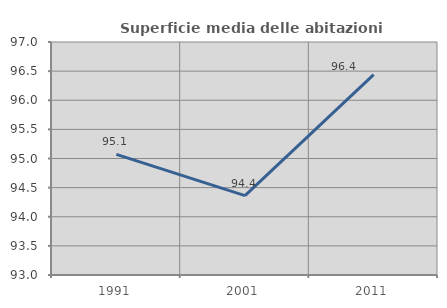
| Category | Superficie media delle abitazioni occupate |
|---|---|
| 1991.0 | 95.071 |
| 2001.0 | 94.363 |
| 2011.0 | 96.44 |